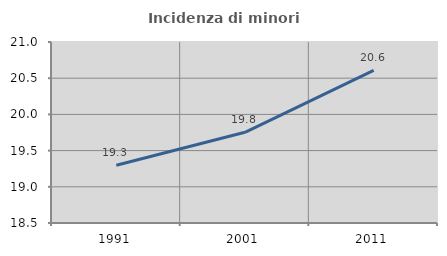
| Category | Incidenza di minori stranieri |
|---|---|
| 1991.0 | 19.298 |
| 2001.0 | 19.753 |
| 2011.0 | 20.609 |